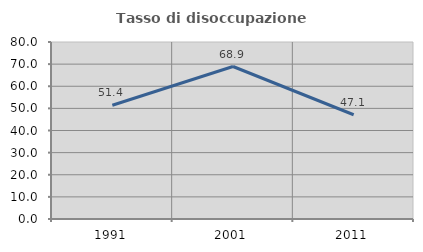
| Category | Tasso di disoccupazione giovanile  |
|---|---|
| 1991.0 | 51.42 |
| 2001.0 | 68.919 |
| 2011.0 | 47.115 |